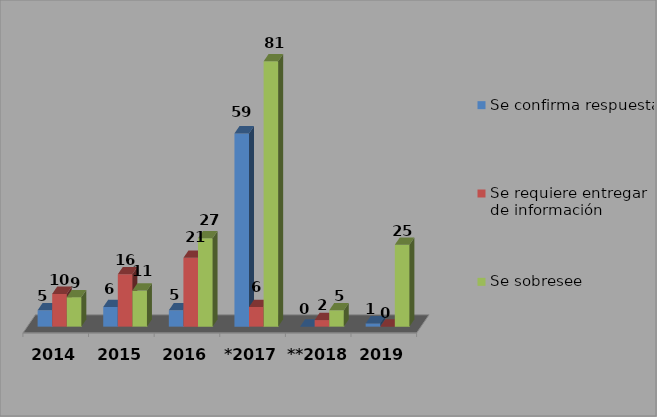
| Category | Se confirma respuesta | Se requiere entregar de información  | Se sobresee  |
|---|---|---|---|
| 2014 | 5 | 10 | 9 |
| 2015 | 6 | 16 | 11 |
| 2016 | 5 | 21 | 27 |
| *2017 | 59 | 6 | 81 |
| **2018 | 0 | 2 | 5 |
| 2019 | 1 | 0 | 25 |